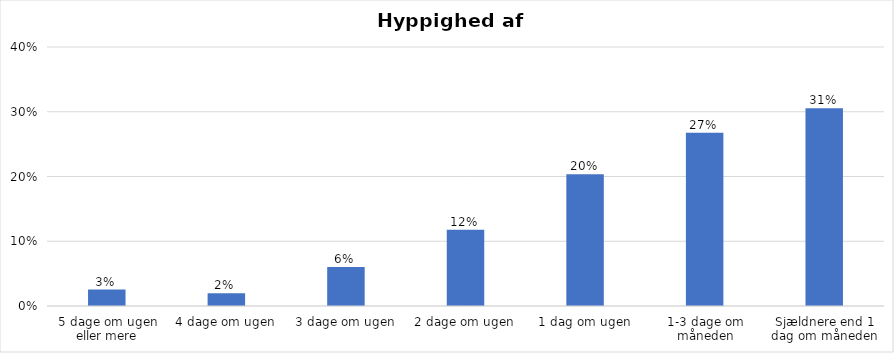
| Category | % |
|---|---|
| 5 dage om ugen eller mere | 0.025 |
| 4 dage om ugen | 0.02 |
| 3 dage om ugen | 0.06 |
| 2 dage om ugen | 0.118 |
| 1 dag om ugen | 0.204 |
| 1-3 dage om måneden | 0.268 |
| Sjældnere end 1 dag om måneden | 0.305 |